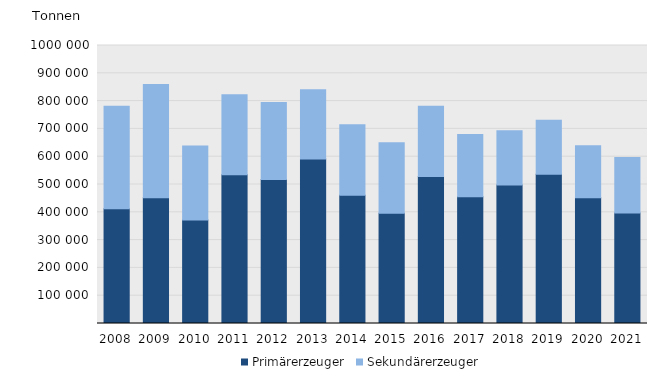
| Category | Primärerzeuger | Sekundärerzeuger |
|---|---|---|
| 2008.0 | 412719 | 368718 |
| 2009.0 | 452024 | 407812 |
| 2010.0 | 371926 | 266534 |
| 2011.0 | 535192 | 287739 |
| 2012.0 | 518083 | 276594 |
| 2013.0 | 591315 | 249291 |
| 2014.0 | 461117 | 253893 |
| 2015.0 | 396331 | 253506 |
| 2016.0 | 528687 | 252656 |
| 2017.0 | 455741 | 223764 |
| 2018.0 | 497812 | 195188 |
| 2019.0 | 536439 | 195089 |
| 2020.0 | 452540 | 187296 |
| 2021.0 | 397815 | 199555 |